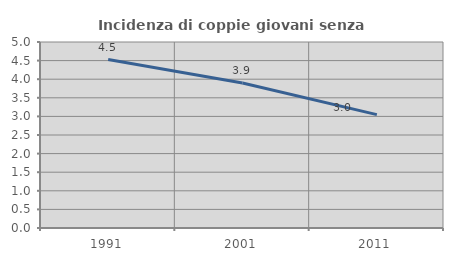
| Category | Incidenza di coppie giovani senza figli |
|---|---|
| 1991.0 | 4.528 |
| 2001.0 | 3.896 |
| 2011.0 | 3.049 |